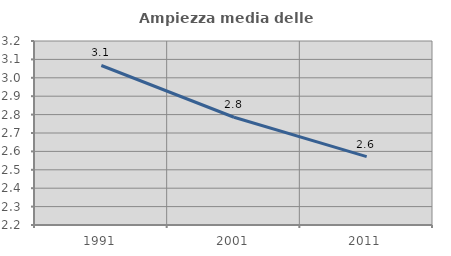
| Category | Ampiezza media delle famiglie |
|---|---|
| 1991.0 | 3.067 |
| 2001.0 | 2.786 |
| 2011.0 | 2.571 |